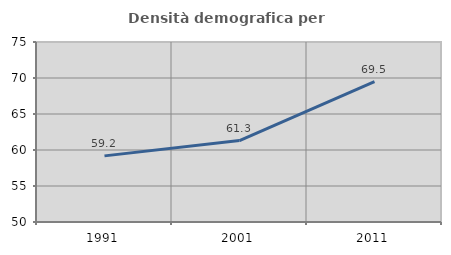
| Category | Densità demografica |
|---|---|
| 1991.0 | 59.184 |
| 2001.0 | 61.304 |
| 2011.0 | 69.502 |